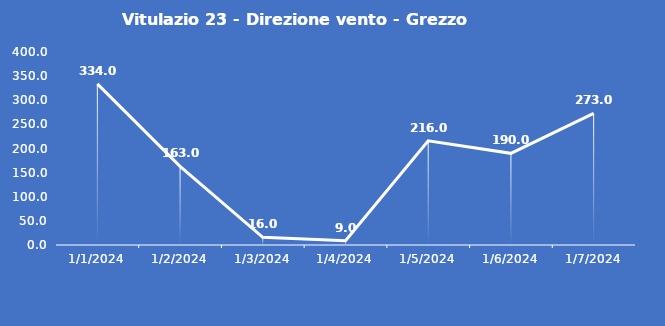
| Category | Vitulazio 23 - Direzione vento - Grezzo (°N) |
|---|---|
| 1/1/24 | 334 |
| 1/2/24 | 163 |
| 1/3/24 | 16 |
| 1/4/24 | 9 |
| 1/5/24 | 216 |
| 1/6/24 | 190 |
| 1/7/24 | 273 |